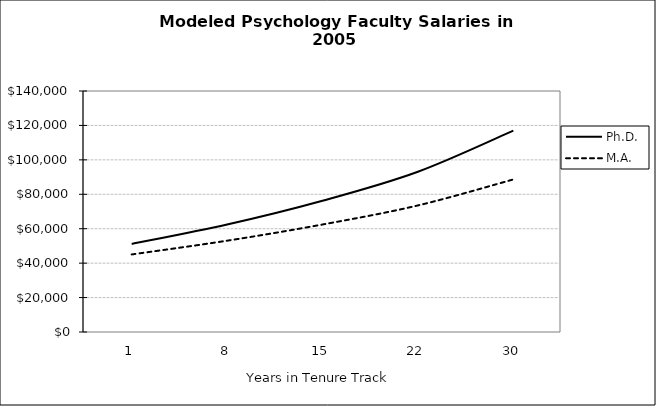
| Category | Ph.D. | M.A. |
|---|---|---|
| 0 | 51144.473 | 45050.93 |
| 1 | 62444.06 | 53041.751 |
| 2 | 76240.119 | 62449.929 |
| 3 | 93084.205 | 73526.864 |
| 4 | 116937.299 | 88611.629 |